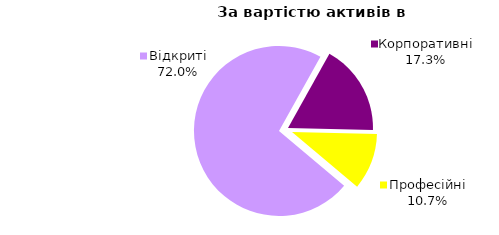
| Category | Series 0 |
|---|---|
| Відкриті | 800380220.553 |
| Корпоративні | 192228616.444 |
| Професійні | 119191880.337 |